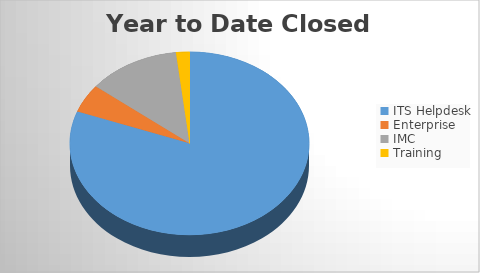
| Category | YTD Closed Tickets | 6M Opened |
|---|---|---|
| ITS Helpdesk | 1460 | 1496 |
| Enterprise | 91 | 95 |
| IMC | 226 | 225 |
| Training | 33 | 43 |